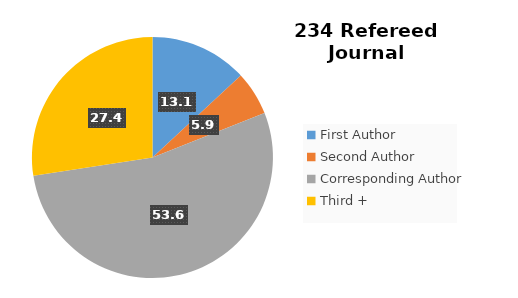
| Category | Number |
|---|---|
| First Author | 13.08 |
| Second Author | 5.907 |
| Corresponding Author | 53.586 |
| Third +  | 27.426 |